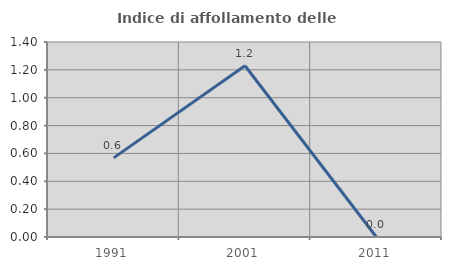
| Category | Indice di affollamento delle abitazioni  |
|---|---|
| 1991.0 | 0.568 |
| 2001.0 | 1.23 |
| 2011.0 | 0 |